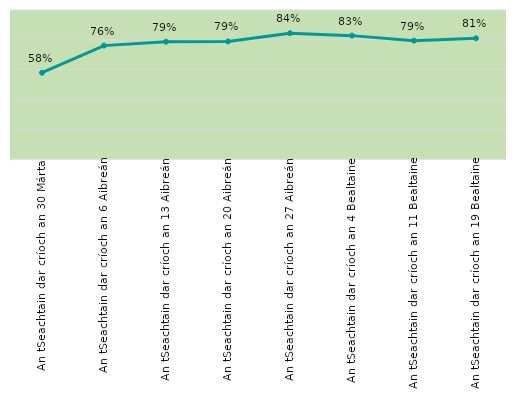
| Category | Series 0 |
|---|---|
| An tSeachtain dar críoch an 30 Márta | 0.579 |
| An tSeachtain dar críoch an 6 Aibreán | 0.761 |
| An tSeachtain dar críoch an 13 Aibreán | 0.787 |
| An tSeachtain dar críoch an 20 Aibreán | 0.789 |
| An tSeachtain dar críoch an 27 Aibreán | 0.844 |
| An tSeachtain dar críoch an 4 Bealtaine | 0.828 |
| An tSeachtain dar críoch an 11 Bealtaine | 0.794 |
| An tSeachtain dar críoch an 19 Bealtaine | 0.81 |